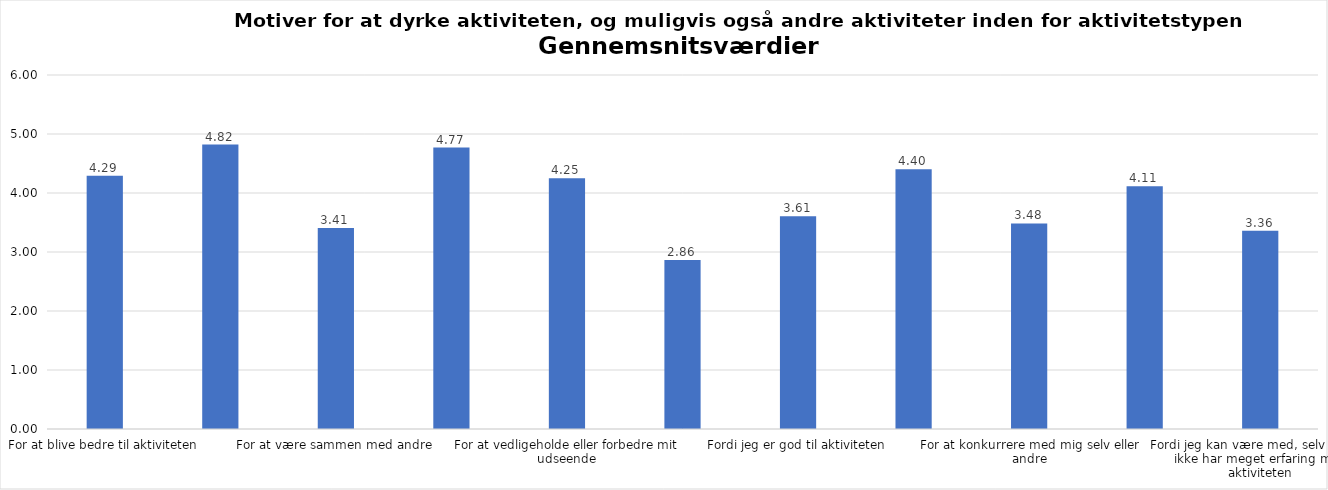
| Category | Gennemsnit |
|---|---|
| For at blive bedre til aktiviteten | 4.294 |
| For at vedligeholde eller forbedre min sundhed (fx helbred, fysisk form) | 4.822 |
| For at være sammen med andre | 3.407 |
| For at gøre noget godt for mig selv | 4.77 |
| For at vedligeholde eller forbedre mit udseende | 4.248 |
| Fordi andre i min omgangskreds opmuntrer mig til det | 2.863 |
| Fordi jeg er god til aktiviteten | 3.607 |
| Fordi jeg godt kan lide aktiviteten | 4.403 |
| For at konkurrere med mig selv eller andre | 3.485 |
| Fordi aktiviteten passer godt ind i min hverdag | 4.115 |
| Fordi jeg kan være med, selv om jeg ikke har meget erfaring med aktiviteten | 3.359 |